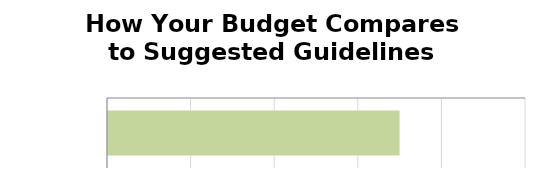
| Category | Series 0 | Series 1 |
|---|---|---|
| Your budget will display here | 0 | 0.35 |